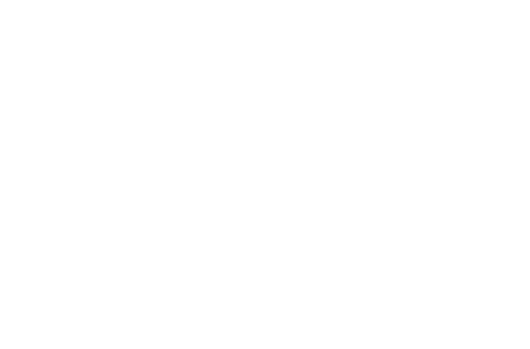
| Category | Ödenen Ana Para | Ödenen Faiz |
|---|---|---|
| 2019 | 316.351 | 226.28 |
| 2020 | 1105.769 | 739.178 |
| 2021 | 1939.715 | 1207.547 |
| 2022 | 2820.703 | 1628.874 |
| 2023 | 3751.386 | 2000.507 |
| 2024 | 4734.566 | 2319.642 |
| 2025 | 5773.206 | 2583.318 |
| 2026 | 6870.433 | 2788.406 |
| 2027 | 8029.552 | 2931.602 |
| 2028 | 9254.054 | 3009.415 |
| 2029 | 10000 | 3023.153 |